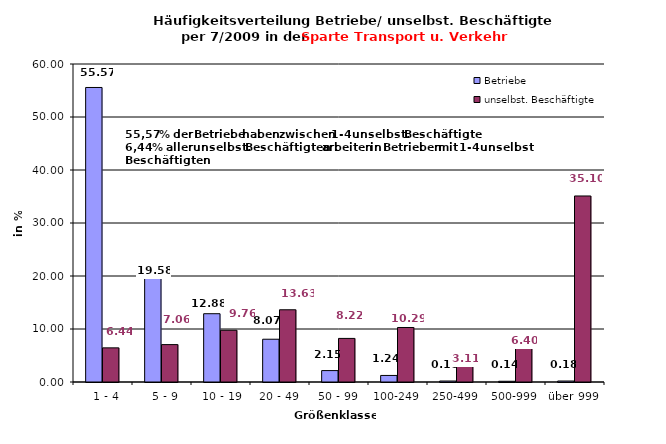
| Category | Betriebe | unselbst. Beschäftigte |
|---|---|---|
|   1 - 4 | 55.571 | 6.442 |
|   5 - 9 | 19.578 | 7.057 |
|  10 - 19 | 12.884 | 9.758 |
| 20 - 49 | 8.07 | 13.628 |
| 50 - 99 | 2.155 | 8.222 |
| 100-249 | 1.238 | 10.286 |
| 250-499 | 0.183 | 3.108 |
| 500-999 | 0.138 | 6.398 |
| über 999 | 0.183 | 35.1 |